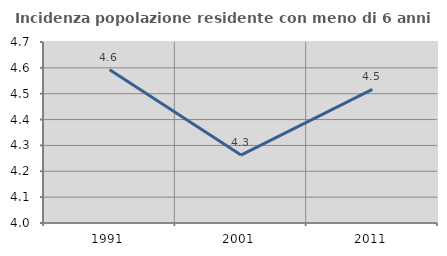
| Category | Incidenza popolazione residente con meno di 6 anni |
|---|---|
| 1991.0 | 4.592 |
| 2001.0 | 4.263 |
| 2011.0 | 4.517 |